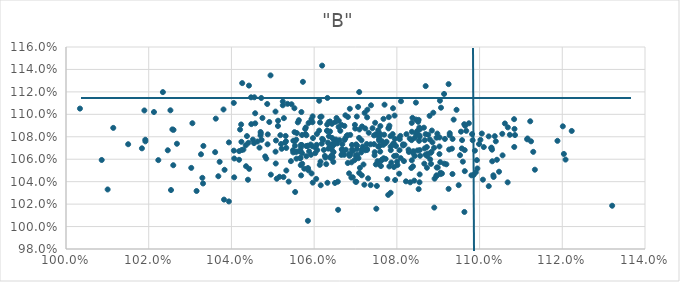
| Category | "B" |
|---|---|
| 1.0805527055321775 | 1.079 |
| 1.0623475421327349 | 1.068 |
| 1.0570346953364729 | 1.073 |
| 1.0524183314947397 | 1.111 |
| 1.0741198010745525 | 1.088 |
| 1.0800450434611313 | 1.058 |
| 1.0586616229771864 | 1.092 |
| 1.1083876056995252 | 1.071 |
| 1.0253885747412885 | 1.033 |
| 1.065582430506883 | 1.074 |
| 1.0757109221264773 | 1.056 |
| 1.0886035080404652 | 1.075 |
| 1.12228052491907 | 1.085 |
| 1.0701603856900455 | 1.073 |
| 1.062192334113176 | 1.077 |
| 1.0383398176135592 | 1.051 |
| 1.089582647149853 | 1.045 |
| 1.0437534491412306 | 1.081 |
| 1.07002034053393 | 1.04 |
| 1.0568144433700104 | 1.073 |
| 1.0690011433612852 | 1.044 |
| 1.079075287268479 | 1.105 |
| 1.0643006757536924 | 1.064 |
| 1.0631444932630019 | 1.085 |
| 1.0686293517835863 | 1.105 |
| 1.0675580613308477 | 1.099 |
| 1.0981875960140222 | 1.082 |
| 1.088053569327695 | 1.06 |
| 1.0746514783297234 | 1.066 |
| 1.0780587553858738 | 1.098 |
| 1.0909096720766747 | 1.047 |
| 1.0405843369030867 | 1.068 |
| 1.0843212946715715 | 1.079 |
| 1.061493660526183 | 1.098 |
| 1.0580867648186612 | 1.072 |
| 1.0755044219900998 | 1.071 |
| 1.0246086068742952 | 1.068 |
| 1.0990860563034925 | 1.048 |
| 1.0925091916889047 | 1.127 |
| 1.0750362343808597 | 1.016 |
| 1.0652549989783946 | 1.078 |
| 1.0836344457616724 | 1.084 |
| 1.0613684012155065 | 1.055 |
| 1.0572874062186277 | 1.129 |
| 1.057094245737392 | 1.065 |
| 1.0809286413687913 | 1.061 |
| 1.042503082800279 | 1.068 |
| 1.075864388228706 | 1.072 |
| 1.0543858107536572 | 1.058 |
| 1.0867444005632232 | 1.077 |
| 1.094946950853255 | 1.037 |
| 1.0744843420825203 | 1.073 |
| 1.0643828346879984 | 1.073 |
| 1.0869657709267475 | 1.125 |
| 1.085267129999292 | 1.033 |
| 1.0835612280097129 | 1.077 |
| 1.1122482165364513 | 1.094 |
| 1.1083541463471644 | 1.096 |
| 1.0579793795429782 | 1.088 |
| 1.1207884925894505 | 1.06 |
| 1.076151952879261 | 1.054 |
| 1.0866398004554279 | 1.056 |
| 1.0693375160002072 | 1.044 |
| 1.060627595333075 | 1.073 |
| 1.0519992841478063 | 1.074 |
| 1.046317747040466 | 1.076 |
| 1.0781963648682877 | 1.09 |
| 1.0673177268486167 | 1.09 |
| 1.0890475567855606 | 1.017 |
| 1.0719295459834264 | 1.055 |
| 1.0903306097897225 | 1.079 |
| 1.075502166966988 | 1.086 |
| 1.0934786829578151 | 1.078 |
| 1.1036725179518572 | 1.081 |
| 1.106839343060777 | 1.088 |
| 1.091420676544435 | 1.118 |
| 1.0471045160449277 | 1.083 |
| 1.0472096419148742 | 1.115 |
| 1.1039217503511805 | 1.076 |
| 1.0625996193526572 | 1.063 |
| 1.083619896878908 | 1.059 |
| 1.064348395981655 | 1.079 |
| 1.041848869580575 | 1.06 |
| 1.0919805197331167 | 1.055 |
| 1.0806465778577683 | 1.068 |
| 1.0584938089537406 | 1.005 |
| 1.0770202338560435 | 1.109 |
| 1.0558192467551115 | 1.083 |
| 1.0442396021491802 | 1.126 |
| 1.1047086612699109 | 1.049 |
| 1.076010430709591 | 1.09 |
| 1.048170094403902 | 1.062 |
| 1.0681613670134698 | 1.098 |
| 1.077966882729202 | 1.087 |
| 1.0470564353410197 | 1.084 |
| 1.0100706446020586 | 1.033 |
| 1.0593795481311237 | 1.047 |
| 1.0673579755156757 | 1.077 |
| 1.0793416564614304 | 1.063 |
| 1.0634915169815025 | 1.093 |
| 1.0706280165722006 | 1.107 |
| 1.025936573016004 | 1.055 |
| 1.0646320686867172 | 1.058 |
| 1.0426085895294799 | 1.128 |
| 1.0614207377274465 | 1.093 |
| 1.0678705818385688 | 1.081 |
| 1.0728582510632467 | 1.104 |
| 1.0855028797990827 | 1.08 |
| 1.0723675806658708 | 1.068 |
| 1.1116010467517834 | 1.078 |
| 1.06469968582062 | 1.066 |
| 1.0637365248109012 | 1.073 |
| 1.0746051429713988 | 1.063 |
| 1.1061210436173503 | 1.092 |
| 1.0641011338882795 | 1.061 |
| 1.0715165992126152 | 1.069 |
| 1.0728089406745773 | 1.097 |
| 1.0507181204741165 | 1.056 |
| 1.0602899837396704 | 1.07 |
| 1.0393886521198228 | 1.075 |
| 1.0855318255847057 | 1.068 |
| 1.082319538010829 | 1.082 |
| 1.0927820243949797 | 1.081 |
| 1.077514716556602 | 1.076 |
| 1.0757703495939435 | 1.08 |
| 1.0638544430359806 | 1.085 |
| 1.076935031759213 | 1.082 |
| 1.0701055955663394 | 1.063 |
| 1.0368346463201483 | 1.045 |
| 1.0545370573752144 | 1.109 |
| 1.0767918021479983 | 1.061 |
| 1.0792949993732777 | 1.053 |
| 1.056784300375171 | 1.071 |
| 1.0650345612335694 | 1.039 |
| 1.0183573816731977 | 1.07 |
| 1.0557228475105398 | 1.061 |
| 1.1067892173280038 | 1.039 |
| 1.0526850912371208 | 1.097 |
| 1.1028754979774424 | 1.07 |
| 1.0840069022873309 | 1.067 |
| 1.0713753105751438 | 1.066 |
| 1.0506695651282516 | 1.067 |
| 1.0418627653514867 | 1.067 |
| 1.0895894339261951 | 1.079 |
| 1.0532614515162184 | 1.07 |
| 1.0795794182737912 | 1.041 |
| 1.0959555988338114 | 1.058 |
| 1.0828271026086933 | 1.069 |
| 1.0612195576805892 | 1.112 |
| 1.0597204009313557 | 1.079 |
| 1.063215545354861 | 1.115 |
| 1.0648608071810475 | 1.077 |
| 1.0642370944437685 | 1.069 |
| 1.0925100883113827 | 1.034 |
| 1.1028273545764846 | 1.07 |
| 1.0962956479004204 | 1.091 |
| 1.084940908756592 | 1.085 |
| 1.0538451529848807 | 1.04 |
| 1.0852644765476025 | 1.095 |
| 1.0439930293754724 | 1.042 |
| 1.120383604642987 | 1.065 |
| 1.108565455204601 | 1.082 |
| 1.0596330017102404 | 1.098 |
| 1.0581210325221782 | 1.063 |
| 1.0428958145945741 | 1.069 |
| 1.0549405898081095 | 1.066 |
| 1.0457567497531053 | 1.092 |
| 1.0555927761657347 | 1.067 |
| 1.0447432721791048 | 1.115 |
| 1.0814831460275498 | 1.073 |
| 1.0709429365337033 | 1.087 |
| 1.0578355127582493 | 1.087 |
| 1.0491578386368035 | 1.093 |
| 1.0776910380339026 | 1.042 |
| 1.063845095983098 | 1.062 |
| 1.0406812302843051 | 1.061 |
| 1.0905851581737358 | 1.048 |
| 1.0957139009490369 | 1.07 |
| 1.0579203865433289 | 1.082 |
| 1.0405689895852592 | 1.11 |
| 1.0994698574235948 | 1.052 |
| 1.0552549573337235 | 1.084 |
| 1.1188348110517448 | 1.076 |
| 1.0722094544344598 | 1.101 |
| 1.0454647353569009 | 1.074 |
| 1.0150311463597002 | 1.073 |
| 1.0749263734297003 | 1.055 |
| 1.1115097401240337 | 1.078 |
| 1.046784452664502 | 1.07 |
| 1.0721366375268808 | 1.037 |
| 1.0730493700859018 | 1.043 |
| 1.05955916508236 | 1.072 |
| 1.0531992643239125 | 1.076 |
| 1.0715193842762178 | 1.046 |
| 1.0657243574189512 | 1.04 |
| 1.0434777704980884 | 1.072 |
| 1.0723609226355062 | 1.087 |
| 1.0315721148591293 | 1.032 |
| 1.0998724489041418 | 1.074 |
| 1.0549630637567653 | 1.076 |
| 1.0615429527701183 | 1.058 |
| 1.044103234296783 | 1.075 |
| 1.0818332156512598 | 1.073 |
| 1.0631449448108377 | 1.091 |
| 1.0926461408283075 | 1.069 |
| 1.0872733190659387 | 1.052 |
| 1.0552286978655123 | 1.105 |
| 1.0744759523680536 | 1.081 |
| 1.0808417193135882 | 1.081 |
| 1.0807031955221305 | 1.078 |
| 1.0707141686665576 | 1.061 |
| 1.0191929981661625 | 1.076 |
| 1.0234282982365486 | 1.12 |
| 1.0846038954242736 | 1.11 |
| 1.0675343122926952 | 1.079 |
| 1.0644984132971778 | 1.062 |
| 1.065955129057201 | 1.094 |
| 1.0570695955931437 | 1.082 |
| 1.0727214112678327 | 1.074 |
| 1.0854745046061571 | 1.039 |
| 1.0684552400719953 | 1.047 |
| 1.0916217050978094 | 1.078 |
| 1.0784895715830434 | 1.071 |
| 1.0715820087938006 | 1.089 |
| 1.090417789367625 | 1.112 |
| 1.067670860875207 | 1.068 |
| 1.0632100376628433 | 1.039 |
| 1.0757171122882607 | 1.078 |
| 1.0659153087605395 | 1.089 |
| 1.0784790144227638 | 1.081 |
| 1.0654105445533861 | 1.097 |
| 1.0763311165104363 | 1.059 |
| 1.0832310316260516 | 1.039 |
| 1.0840015599802708 | 1.065 |
| 1.033136050696859 | 1.038 |
| 1.0906719689579485 | 1.106 |
| 1.100811966607262 | 1.042 |
| 1.1320616673039434 | 1.019 |
| 1.084204624292881 | 1.041 |
| 1.0663256386591184 | 1.085 |
| 1.1084432433469433 | 1.087 |
| 1.0583380349109726 | 1.072 |
| 1.0518241497062912 | 1.081 |
| 1.0532721359148423 | 1.05 |
| 1.0834911419920543 | 1.052 |
| 1.0560538328854956 | 1.093 |
| 1.0615924003898738 | 1.037 |
| 1.0896394172275967 | 1.053 |
| 1.0846554500985266 | 1.082 |
| 1.0657926530219106 | 1.015 |
| 1.0889927292085944 | 1.07 |
| 1.0487883499579245 | 1.082 |
| 1.1054892865576031 | 1.083 |
| 1.0362140275139557 | 1.096 |
| 1.0596031680909583 | 1.093 |
| 1.0259985365162823 | 1.086 |
| 1.0697679947515337 | 1.059 |
| 1.0470367657837443 | 1.081 |
| 1.0685264004266455 | 1.065 |
| 1.0457426622062582 | 1.101 |
| 1.0669043420930198 | 1.067 |
| 1.0371524547500643 | 1.058 |
| 1.0794527867147983 | 1.099 |
| 1.052424337897913 | 1.108 |
| 1.078494219071938 | 1.03 |
| 1.0575959883874642 | 1.052 |
| 1.0566990543680526 | 1.061 |
| 1.0902970649897603 | 1.065 |
| 1.0873124736583635 | 1.063 |
| 1.0798649589531555 | 1.063 |
| 1.0666799477974978 | 1.069 |
| 1.0475004181710204 | 1.097 |
| 1.051636233127789 | 1.044 |
| 1.0790560896307697 | 1.073 |
| 1.0855166630925108 | 1.046 |
| 1.0472918346679658 | 1.077 |
| 1.1022031836033364 | 1.08 |
| 1.0801525781110148 | 1.055 |
| 1.0934458202677333 | 1.047 |
| 1.0753302841978754 | 1.058 |
| 1.074895096195444 | 1.082 |
| 1.0257155617595337 | 1.087 |
| 1.0902985325890617 | 1.071 |
| 1.094429677370994 | 1.104 |
| 1.0593407253261837 | 1.096 |
| 1.112980263051276 | 1.067 |
| 1.0252473896231604 | 1.104 |
| 1.0763887876194698 | 1.059 |
| 1.056302117883252 | 1.095 |
| 1.083603578875073 | 1.092 |
| 1.0882621642515573 | 1.056 |
| 1.0665953092923124 | 1.064 |
| 1.0451917553414456 | 1.077 |
| 1.08542966089542 | 1.088 |
| 1.0566819903065687 | 1.068 |
| 1.0568525460497276 | 1.046 |
| 1.0904980636912203 | 1.057 |
| 1.038205685872613 | 1.024 |
| 1.050957648305096 | 1.043 |
| 1.0486552735791559 | 1.109 |
| 1.0967845252508148 | 1.085 |
| 1.0747565371183194 | 1.092 |
| 1.091470528282598 | 1.056 |
| 1.0955052081316232 | 1.085 |
| 1.0699358827567416 | 1.087 |
| 1.0553637323521716 | 1.072 |
| 1.068532886192175 | 1.063 |
| 1.0710680551183274 | 1.052 |
| 1.0728061188866285 | 1.068 |
| 1.0937343664073185 | 1.095 |
| 1.055313367094416 | 1.076 |
| 1.081504885640746 | 1.072 |
| 1.0086343757203793 | 1.059 |
| 1.085374738678993 | 1.076 |
| 1.103334966670282 | 1.046 |
| 1.0708945027736037 | 1.12 |
| 1.0881766488780689 | 1.066 |
| 1.0326407802020305 | 1.064 |
| 1.0736770540558978 | 1.037 |
| 1.0985860156302347 | 1.046 |
| 1.0780468613547034 | 1.088 |
| 1.0957689477789925 | 1.077 |
| 1.07569349042354 | 1.077 |
| 1.0993535504102971 | 1.059 |
| 1.0854570025452321 | 1.081 |
| 1.0708693321309437 | 1.079 |
| 1.0965202967524001 | 1.09 |
| 1.1030580921632607 | 1.058 |
| 1.1201293346484333 | 1.089 |
| 1.0891222012449464 | 1.043 |
| 1.0703867762629227 | 1.072 |
| 1.0191759545768277 | 1.077 |
| 1.089885333168155 | 1.053 |
| 1.0883736531174313 | 1.067 |
| 1.0867121661278547 | 1.07 |
| 1.0189506647760387 | 1.103 |
| 1.0531115071057282 | 1.081 |
| 1.0839047959385046 | 1.054 |
| 1.0506593234306267 | 1.102 |
| 1.0329687709345494 | 1.043 |
| 1.0507647538314606 | 1.077 |
| 1.0612117788198583 | 1.085 |
| 1.071447232423274 | 1.077 |
| 1.0785282154014795 | 1.068 |
| 1.077282774808669 | 1.06 |
| 1.095273638038379 | 1.064 |
| 1.103012396136222 | 1.069 |
| 1.070221087647467 | 1.062 |
| 1.0927844448482893 | 1.083 |
| 1.0607488175534663 | 1.068 |
| 1.04234831206608 | 1.091 |
| 1.0879166870169763 | 1.099 |
| 1.059158823671085 | 1.073 |
| 1.0651533432611162 | 1.093 |
| 1.0619337780609026 | 1.143 |
| 1.0617836830533476 | 1.098 |
| 1.0268208733456152 | 1.074 |
| 1.1005446570070978 | 1.083 |
| 1.0512472431376463 | 1.09 |
| 1.0905008944217802 | 1.047 |
| 1.0779116152739912 | 1.028 |
| 1.0512756345932848 | 1.094 |
| 1.0821991190331348 | 1.04 |
| 1.069035558537668 | 1.057 |
| 1.0585054037687147 | 1.052 |
| 1.0964263713265057 | 1.049 |
| 1.0851544937196003 | 1.093 |
| 1.082900384523768 | 1.066 |
| 1.113372007854567 | 1.051 |
| 1.08561461299487 | 1.063 |
| 1.084792759628771 | 1.084 |
| 1.0644186336665566 | 1.072 |
| 1.0759766308873884 | 1.067 |
| 1.0602666283927151 | 1.065 |
| 1.0627271498882278 | 1.061 |
| 1.0897866502915918 | 1.083 |
| 1.0360644080309676 | 1.066 |
| 1.0980285851939222 | 1.046 |
| 1.0424158244217212 | 1.076 |
| 1.0789919859916155 | 1.082 |
| 1.0406683088301427 | 1.044 |
| 1.0380844943673926 | 1.104 |
| 1.0751746650080696 | 1.082 |
| 1.066810600502078 | 1.073 |
| 1.0865426060096748 | 1.088 |
| 1.0455503597141036 | 1.115 |
| 1.1034029331800224 | 1.044 |
| 1.0708927111118411 | 1.048 |
| 1.088802776171584 | 1.101 |
| 1.0732037467360438 | 1.084 |
| 1.0846044584159045 | 1.095 |
| 1.0521509534390079 | 1.069 |
| 1.049529496879656 | 1.046 |
| 1.084966979267804 | 1.068 |
| 1.0484266403443496 | 1.061 |
| 1.0592371633185904 | 1.064 |
| 1.0764335776012304 | 1.076 |
| 1.0717484875451393 | 1.071 |
| 1.0856207336330712 | 1.087 |
| 1.0581344298834907 | 1.081 |
| 1.0869112242362997 | 1.064 |
| 1.0810007116712887 | 1.112 |
| 1.068741566256558 | 1.064 |
| 1.10222053770355 | 1.036 |
| 1.0759850875264116 | 1.082 |
| 1.0687318820028786 | 1.082 |
| 1.0792037227664646 | 1.073 |
| 1.0879751502838162 | 1.078 |
| 1.070397610724895 | 1.064 |
| 1.0756792076826913 | 1.071 |
| 1.079253321179735 | 1.074 |
| 1.0786636308247546 | 1.057 |
| 1.0535856547278413 | 1.109 |
| 1.100208773337571 | 1.077 |
| 1.0964026112923175 | 1.068 |
| 1.057112792304949 | 1.056 |
| 1.079787340060027 | 1.072 |
| 1.0332186235443308 | 1.072 |
| 1.063436638488855 | 1.069 |
| 1.088461611132356 | 1.086 |
| 1.066806064532557 | 1.068 |
| 1.064725688828553 | 1.073 |
| 1.0843063710479757 | 1.063 |
| 1.0767021691049103 | 1.073 |
| 1.0737524230204123 | 1.108 |
| 1.0666287355062638 | 1.091 |
| 1.063337296161733 | 1.075 |
| 1.0529505173426843 | 1.075 |
| 1.10101666832196 | 1.071 |
| 1.0691545487950342 | 1.069 |
| 1.0698535271152394 | 1.091 |
| 1.0569156059449365 | 1.102 |
| 1.0596662131155825 | 1.039 |
| 1.0393818866053655 | 1.022 |
| 1.0635790581180071 | 1.081 |
| 1.0567662225733525 | 1.055 |
| 1.0681362173966968 | 1.057 |
| 1.069307138203196 | 1.067 |
| 1.0781805637999549 | 1.054 |
| 1.0831217341956458 | 1.078 |
| 1.0619413318896112 | 1.078 |
| 1.030286617755038 | 1.052 |
| 1.0114273990583826 | 1.088 |
| 1.0703178998990466 | 1.098 |
| 1.0736620617038253 | 1.073 |
| 1.0872486677330706 | 1.071 |
| 1.0874421797641212 | 1.065 |
| 1.0487376673481692 | 1.073 |
| 1.0558981491956365 | 1.067 |
| 1.066137026969279 | 1.077 |
| 1.1041982078988715 | 1.06 |
| 1.0771438437008125 | 1.074 |
| 1.0566409323249304 | 1.067 |
| 1.0629201573013556 | 1.056 |
| 1.0672611247530208 | 1.064 |
| 1.0618379830785107 | 1.074 |
| 1.0212652370149244 | 1.102 |
| 1.0442901548331054 | 1.051 |
| 1.058776173464119 | 1.067 |
| 1.0566118895813406 | 1.061 |
| 1.0305614449603941 | 1.092 |
| 1.0933142763782437 | 1.069 |
| 1.058619926758138 | 1.05 |
| 1.0795024167007128 | 1.078 |
| 1.0556679880537851 | 1.077 |
| 1.0983277337297819 | 1.077 |
| 1.0963312660941322 | 1.013 |
| 1.0604972243717992 | 1.042 |
| 1.0895937662014916 | 1.046 |
| 1.0817118647122215 | 1.058 |
| 1.060675008436084 | 1.083 |
| 1.0584549945933375 | 1.072 |
| 1.0869575767287738 | 1.082 |
| 1.0448072148573477 | 1.091 |
| 1.0702884551668024 | 1.069 |
| 1.0767652105186698 | 1.096 |
| 1.0494569692404503 | 1.135 |
| 1.0435358994981745 | 1.054 |
| 1.0223232229783128 | 1.059 |
| 1.0837716671595397 | 1.097 |
| 1.1073152154321144 | 1.082 |
| 1.1124483355552495 | 1.076 |
| 1.0805646961088236 | 1.047 |
| 1.0727487074871875 | 1.069 |
| 1.0701879481814305 | 1.04 |
| 1.0033769550498561 | 1.105 |
| 1.0974195236393864 | 1.092 |
| 1.0638419601359728 | 1.094 |
| 1.0875871602482186 | 1.082 |
| 1.0548813339064766 | 1.068 |
| 1.0525853141128585 | 1.044 |
| 1.0643073064158388 | 1.092 |
| 1.0680831495104692 | 1.081 |
| 1.063134310333551 | 1.085 |
| 1.0420880575682632 | 1.086 |
| 1.0751710025119299 | 1.036 |
| 1.0554109511423493 | 1.031 |
| 1.0988720895637434 | 1.068 |
| 1.0691472273301672 | 1.073 |
| 1.1055619802919856 | 1.063 |